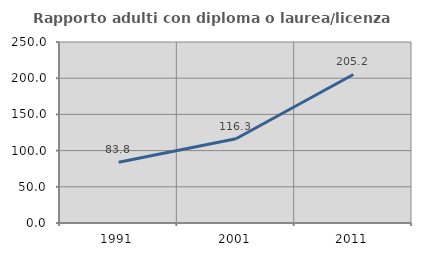
| Category | Rapporto adulti con diploma o laurea/licenza media  |
|---|---|
| 1991.0 | 83.813 |
| 2001.0 | 116.32 |
| 2011.0 | 205.151 |